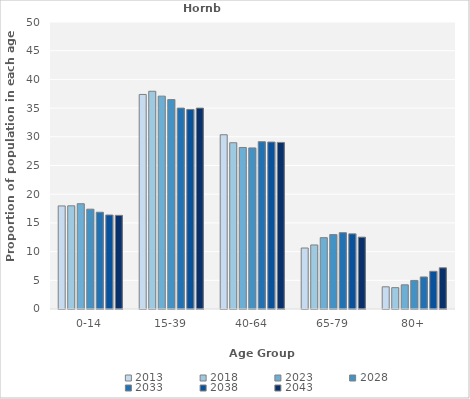
| Category | 2013 | 2018 | 2023 | 2028 | 2033 | 2038 | 2043 |
|---|---|---|---|---|---|---|---|
| 0-14 | 17.956 | 17.975 | 18.34 | 17.391 | 16.86 | 16.374 | 16.316 |
| 15-39 | 37.378 | 37.934 | 37.085 | 36.482 | 35 | 34.771 | 35 |
| 40-64 | 30.356 | 28.967 | 28.138 | 28.063 | 29.147 | 29.084 | 29.023 |
| 65-79 | 10.622 | 11.157 | 12.429 | 12.964 | 13.295 | 13.092 | 12.519 |
| 80+ | 3.867 | 3.719 | 4.211 | 4.98 | 5.581 | 6.565 | 7.18 |